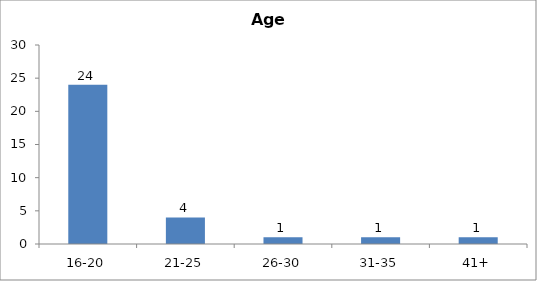
| Category | Age |
|---|---|
| 16-20 | 24 |
| 21-25 | 4 |
| 26-30 | 1 |
| 31-35 | 1 |
| 41+ | 1 |